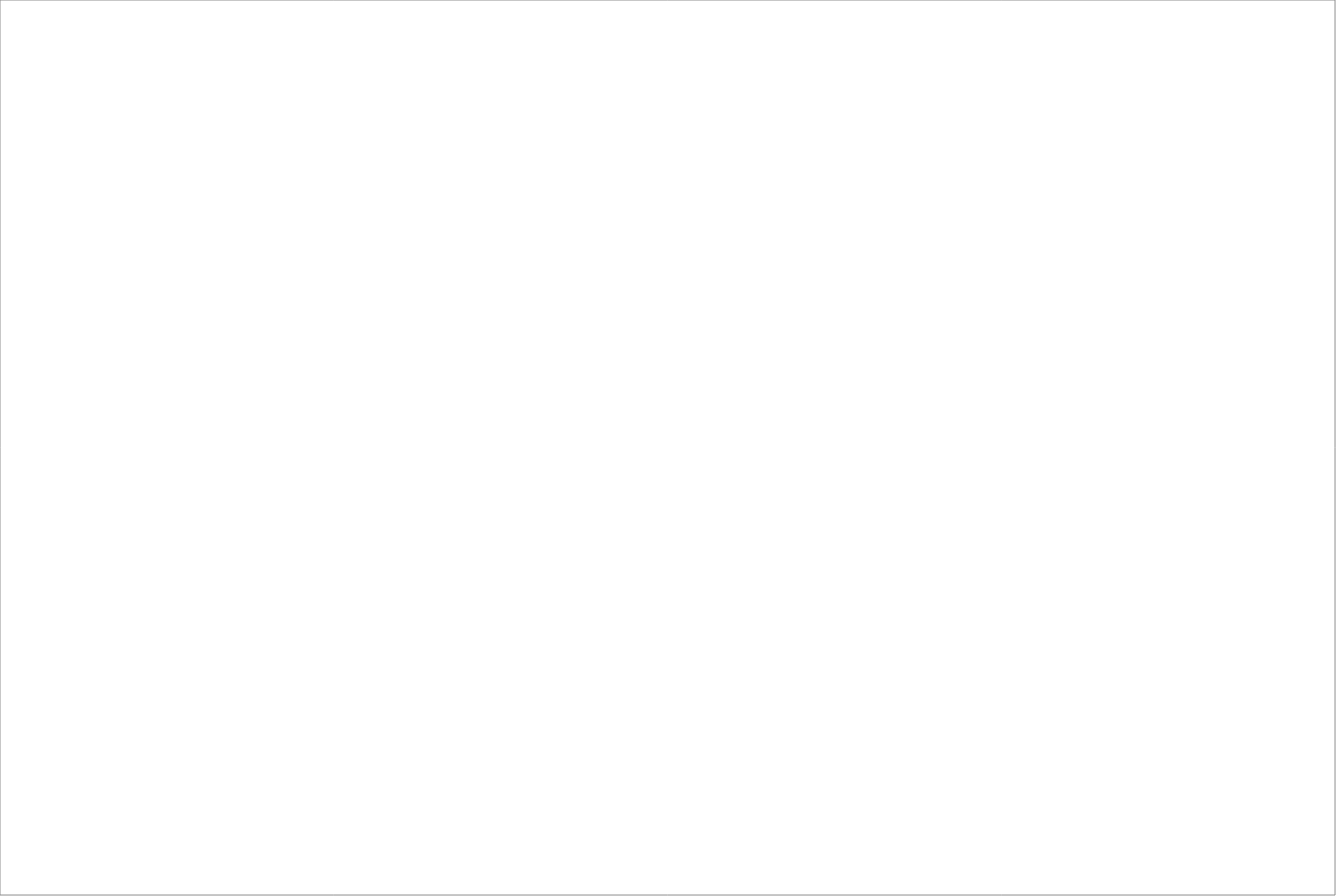
| Category | Total |
|---|---|
| Randstad AB | 74.625 |
| StudentConsulting Sweden AB | 65 |
| Poolia Sverige AB | 65 |
| Academic Work Sweden AB  | 62.5 |
| Experis AB | 62.5 |